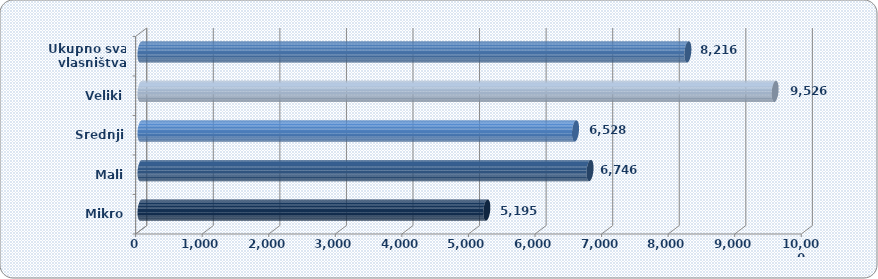
| Category | Prosječna mjesečna neto plaća po zaposlenom |
|---|---|
| Mikro | 5195.26 |
| Mali | 6745.668 |
| Srednji | 6527.63 |
| Veliki | 9525.885 |
| Ukupno sva
 vlasništva | 8215.801 |